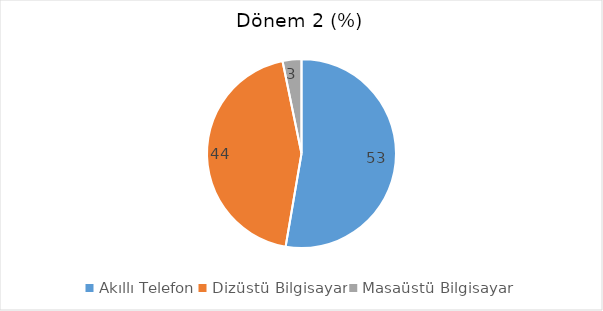
| Category | Dönem 2  (%) |
|---|---|
| Akıllı Telefon | 52.688 |
| Dizüstü Bilgisayar | 44.086 |
| Masaüstü Bilgisayar | 3.226 |